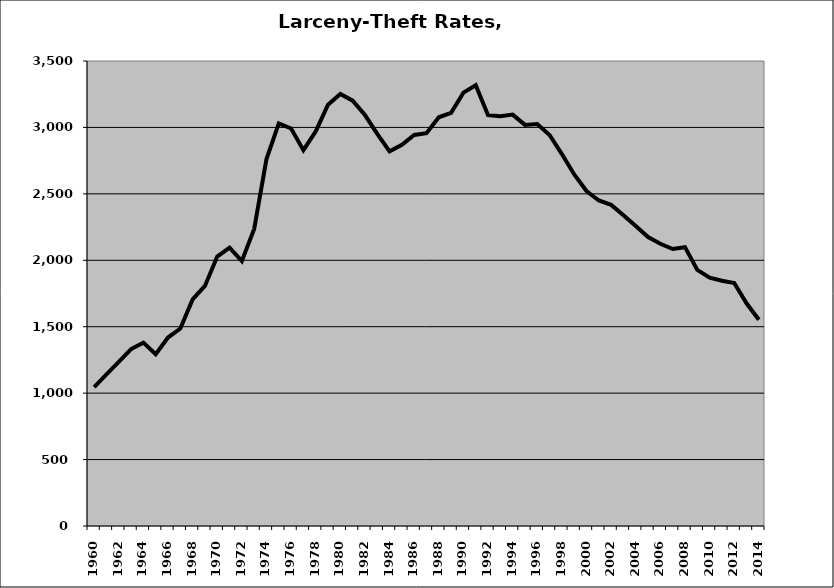
| Category | Larceny-Theft |
|---|---|
| 1960.0 | 1045.743 |
| 1961.0 | 1140.632 |
| 1962.0 | 1235.029 |
| 1963.0 | 1332.096 |
| 1964.0 | 1380.332 |
| 1965.0 | 1293.067 |
| 1966.0 | 1418.597 |
| 1967.0 | 1486.055 |
| 1968.0 | 1705.24 |
| 1969.0 | 1806.825 |
| 1970.0 | 2028.41 |
| 1971.0 | 2095.552 |
| 1972.0 | 1993.992 |
| 1973.0 | 2236.232 |
| 1974.0 | 2761.495 |
| 1975.0 | 3030.04 |
| 1976.0 | 2991.771 |
| 1977.0 | 2828.475 |
| 1978.0 | 2969.937 |
| 1979.0 | 3170.632 |
| 1980.0 | 3252.461 |
| 1981.0 | 3201.187 |
| 1982.0 | 3093.169 |
| 1983.0 | 2951.95 |
| 1984.0 | 2820.337 |
| 1985.0 | 2869.788 |
| 1986.0 | 2943.016 |
| 1987.0 | 2957.106 |
| 1988.0 | 3076.473 |
| 1989.0 | 3109.933 |
| 1990.0 | 3261.963 |
| 1991.0 | 3317.526 |
| 1992.0 | 3091.892 |
| 1993.0 | 3083.953 |
| 1994.0 | 3096.392 |
| 1995.0 | 3018.96 |
| 1996.0 | 3026.209 |
| 1997.0 | 2943.342 |
| 1998.0 | 2799.427 |
| 1999.0 | 2646.308 |
| 2000.0 | 2521.569 |
| 2001.0 | 2450.091 |
| 2002.0 | 2417.1 |
| 2003.0 | 2339.355 |
| 2004.0 | 2257.903 |
| 2005.0 | 2175.109 |
| 2006.0 | 2124.21 |
| 2007.0 | 2084.497 |
| 2008.0 | 2098.84 |
| 2009.0 | 1927.29 |
| 2010.0 | 1868.918 |
| 2011.0 | 1845.774 |
| 2012.0 | 1828.649 |
| 2013.0 | 1676.104 |
| 2014.0 | 1552.151 |